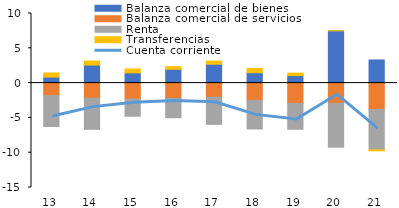
| Category | Balanza comercial de bienes | Balanza comercial de servicios | Renta | Transferencias |
|---|---|---|---|---|
| 13.0 | 0.865 | -1.79 | -4.442 | 0.59 |
| 14.0 | 2.593 | -2.179 | -4.459 | 0.585 |
| 15.0 | 1.475 | -2.298 | -2.468 | 0.556 |
| 16.0 | 1.985 | -2.197 | -2.782 | 0.373 |
| 17.0 | 2.712 | -2.032 | -3.895 | 0.456 |
| 18.0 | 1.49 | -2.481 | -4.111 | 0.618 |
| 19.0 | 1.082 | -2.901 | -3.736 | 0.35 |
| 20.0 | 7.504 | -2.91 | -6.298 | 0.011 |
| 21.0 | 3.322 | -3.78 | -5.813 | -0.137 |